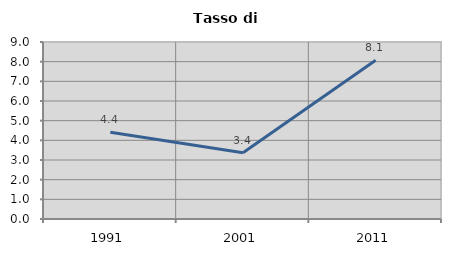
| Category | Tasso di disoccupazione   |
|---|---|
| 1991.0 | 4.412 |
| 2001.0 | 3.373 |
| 2011.0 | 8.076 |